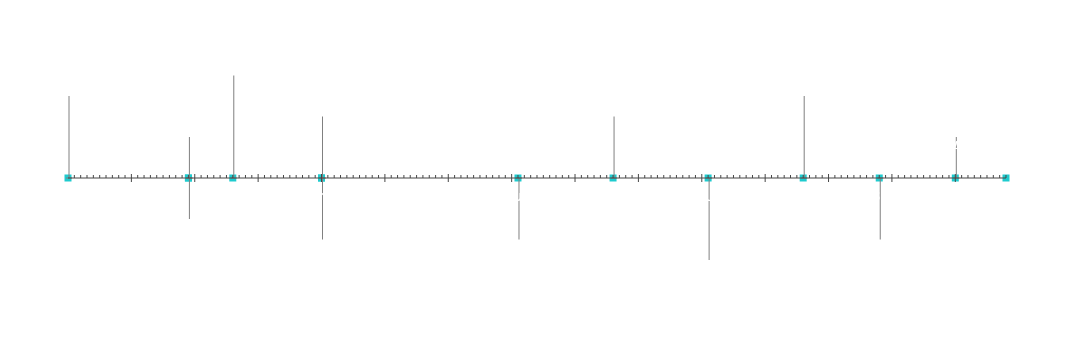
| Category | Posisjon |
|---|---|
| Prosjektstart | 20 |
| Milepæl 1 | 10 |
| Milepæl 2 | -10 |
| Milepæl 3 | 25 |
| Milepæl 4 | -15 |
| Milepæl 5 | 15 |
| Milepæl 6 | -15 |
| Milepæl 7 | 15 |
| Milepæl 8 | -20 |
| Milepæl 9 | 20 |
| Milepæl 10 | -15 |
| Milestone 11 | 10 |
| Prosjektavslutning | 5 |